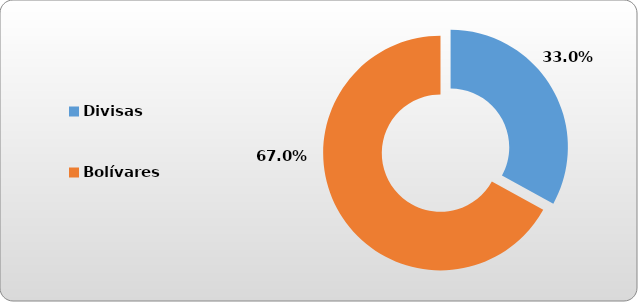
| Category | Divisas |
|---|---|
| Divisas | 47376.229 |
| Bolívares | 96094.595 |